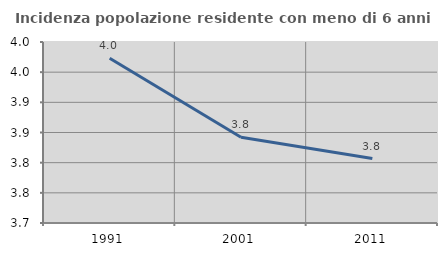
| Category | Incidenza popolazione residente con meno di 6 anni |
|---|---|
| 1991.0 | 3.973 |
| 2001.0 | 3.842 |
| 2011.0 | 3.807 |